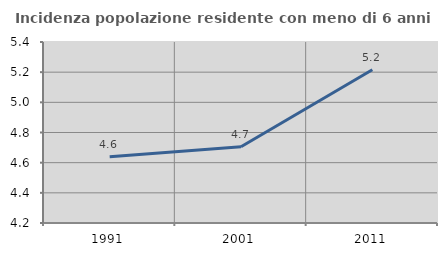
| Category | Incidenza popolazione residente con meno di 6 anni |
|---|---|
| 1991.0 | 4.639 |
| 2001.0 | 4.705 |
| 2011.0 | 5.216 |